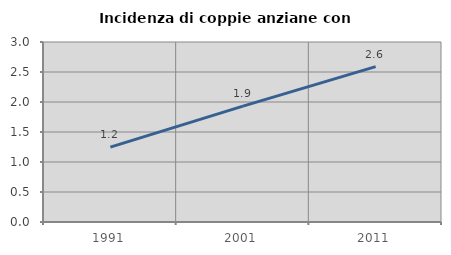
| Category | Incidenza di coppie anziane con figli |
|---|---|
| 1991.0 | 1.247 |
| 2001.0 | 1.931 |
| 2011.0 | 2.589 |